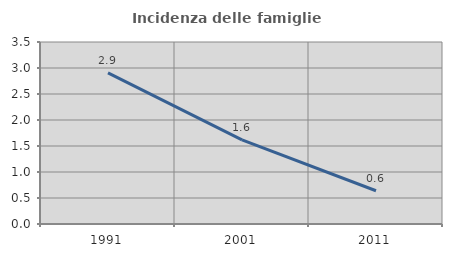
| Category | Incidenza delle famiglie numerose |
|---|---|
| 1991.0 | 2.907 |
| 2001.0 | 1.617 |
| 2011.0 | 0.64 |